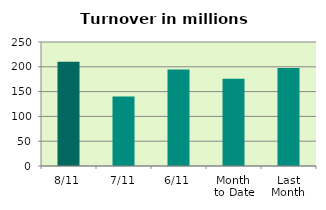
| Category | Series 0 |
|---|---|
| 8/11 | 210.215 |
| 7/11 | 140.018 |
| 6/11 | 194.31 |
| Month 
to Date | 175.968 |
| Last
Month | 197.652 |